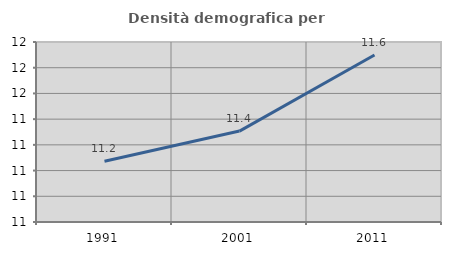
| Category | Densità demografica |
|---|---|
| 1991.0 | 11.237 |
| 2001.0 | 11.354 |
| 2011.0 | 11.649 |